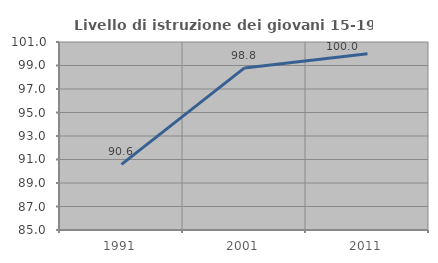
| Category | Livello di istruzione dei giovani 15-19 anni |
|---|---|
| 1991.0 | 90.588 |
| 2001.0 | 98.795 |
| 2011.0 | 100 |